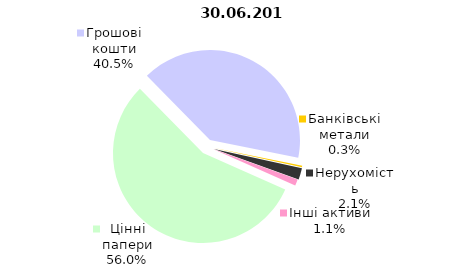
| Category | Всього |
|---|---|
| Цінні папери | 842.31 |
| Грошові кошти | 609.822 |
| Банківські метали | 4.161 |
| Нерухомість | 31.591 |
| Інші активи | 17.204 |